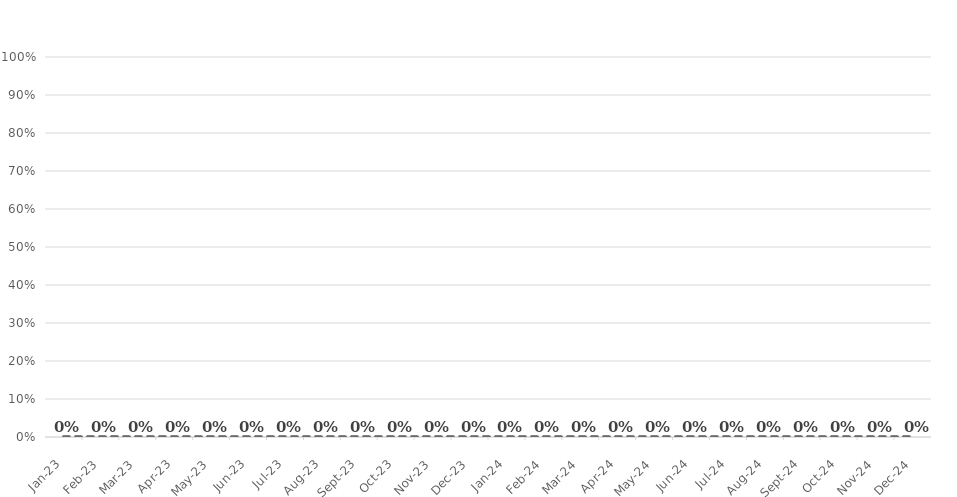
| Category | Wealth-building rate |
|---|---|
| 2023-01-01 | 0 |
| 2023-02-01 | 0 |
| 2023-03-01 | 0 |
| 2023-04-01 | 0 |
| 2023-05-01 | 0 |
| 2023-06-01 | 0 |
| 2023-07-01 | 0 |
| 2023-08-01 | 0 |
| 2023-09-01 | 0 |
| 2023-10-01 | 0 |
| 2023-11-01 | 0 |
| 2023-12-01 | 0 |
| 2024-01-01 | 0 |
| 2024-02-01 | 0 |
| 2024-03-01 | 0 |
| 2024-04-01 | 0 |
| 2024-05-01 | 0 |
| 2024-06-01 | 0 |
| 2024-07-01 | 0 |
| 2024-08-01 | 0 |
| 2024-09-01 | 0 |
| 2024-10-01 | 0 |
| 2024-11-01 | 0 |
| 2024-12-01 | 0 |